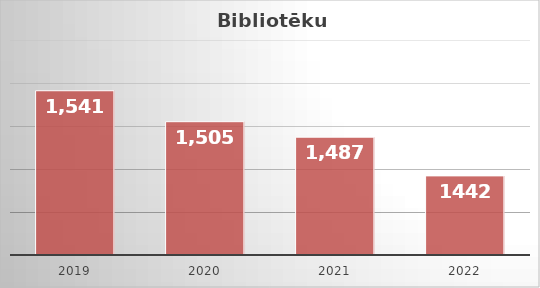
| Category | Series 0 |
|---|---|
| 2019.0 | 1541 |
| 2020.0 | 1505 |
| 2021.0 | 1487 |
| 2022.0 | 1442 |